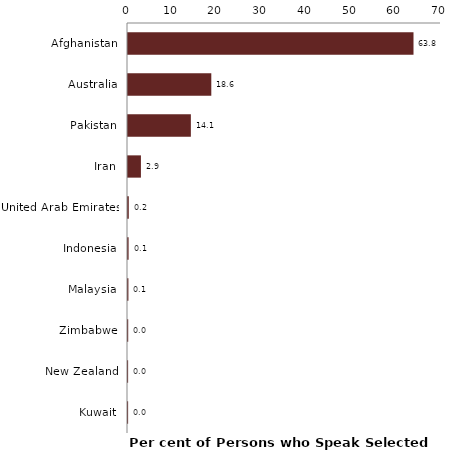
| Category | Series 0 |
|---|---|
| Afghanistan | 63.85 |
| Australia | 18.63 |
| Pakistan | 14.059 |
| Iran | 2.889 |
| United Arab Emirates | 0.175 |
| Indonesia | 0.134 |
| Malaysia | 0.093 |
| Zimbabwe | 0.046 |
| New Zealand | 0.026 |
| Kuwait | 0.026 |